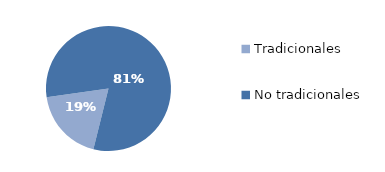
| Category | Series 0 |
|---|---|
| Tradicionales | 350.82 |
| No tradicionales | 1510.877 |